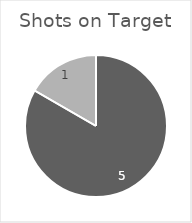
| Category | Shots on Target |
|---|---|
| Liverpool | 5 |
| Manchester United | 1 |